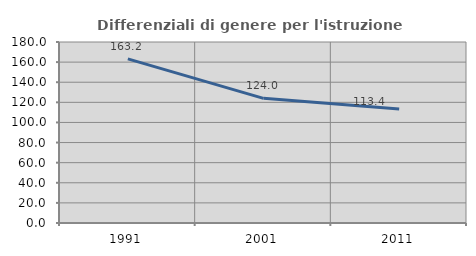
| Category | Differenziali di genere per l'istruzione superiore |
|---|---|
| 1991.0 | 163.172 |
| 2001.0 | 123.96 |
| 2011.0 | 113.402 |